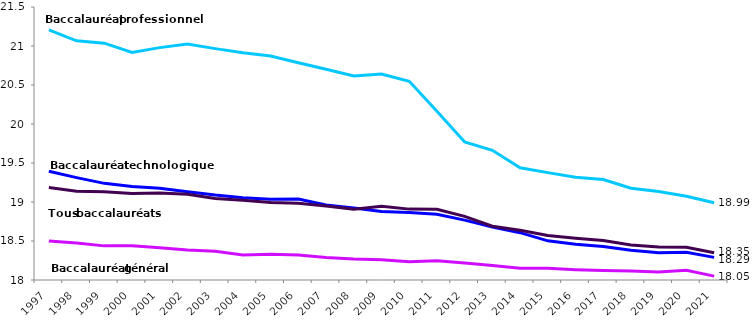
| Category | Baccalauréat général | Baccalauréat technologique | Baccalauréat professionnel | Tous baccalauréats |
|---|---|---|---|---|
| 1997.0 | 18.501 | 19.394 | 21.207 | 19.185 |
| 1998.0 | 18.475 | 19.313 | 21.067 | 19.139 |
| 1999.0 | 18.438 | 19.239 | 21.036 | 19.13 |
| 2000.0 | 18.44 | 19.2 | 20.918 | 19.109 |
| 2001.0 | 18.413 | 19.177 | 20.979 | 19.115 |
| 2002.0 | 18.383 | 19.13 | 21.025 | 19.099 |
| 2003.0 | 18.368 | 19.089 | 20.967 | 19.046 |
| 2004.0 | 18.322 | 19.055 | 20.913 | 19.021 |
| 2005.0 | 18.33 | 19.037 | 20.871 | 18.994 |
| 2006.0 | 18.319 | 19.038 | 20.785 | 18.985 |
| 2007.0 | 18.289 | 18.96 | 20.702 | 18.948 |
| 2008.0 | 18.27 | 18.923 | 20.615 | 18.908 |
| 2009.0 | 18.261 | 18.879 | 20.642 | 18.945 |
| 2010.0 | 18.235 | 18.864 | 20.547 | 18.909 |
| 2011.0 | 18.245 | 18.843 | 20.164 | 18.907 |
| 2012.0 | 18.217 | 18.768 | 19.769 | 18.816 |
| 2013.0 | 18.187 | 18.679 | 19.663 | 18.69 |
| 2014.0 | 18.151 | 18.607 | 19.438 | 18.638 |
| 2015.0 | 18.149 | 18.502 | 19.377 | 18.571 |
| 2016.0 | 18.133 | 18.46 | 19.319 | 18.535 |
| 2017.0 | 18.122 | 18.43 | 19.288 | 18.505 |
| 2018.0 | 18.115 | 18.38 | 19.176 | 18.45 |
| 2019.0 | 18.103 | 18.348 | 19.136 | 18.422 |
| 2020.0 | 18.125 | 18.356 | 19.074 | 18.421 |
| 2021.0 | 18.05 | 18.29 | 18.99 | 18.35 |